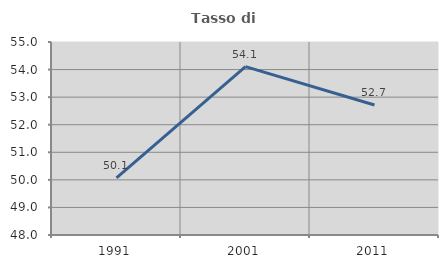
| Category | Tasso di occupazione   |
|---|---|
| 1991.0 | 50.068 |
| 2001.0 | 54.105 |
| 2011.0 | 52.714 |